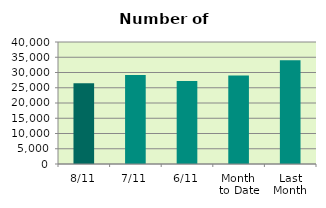
| Category | Series 0 |
|---|---|
| 8/11 | 26486 |
| 7/11 | 29216 |
| 6/11 | 27200 |
| Month 
to Date | 29003 |
| Last
Month | 34034.348 |